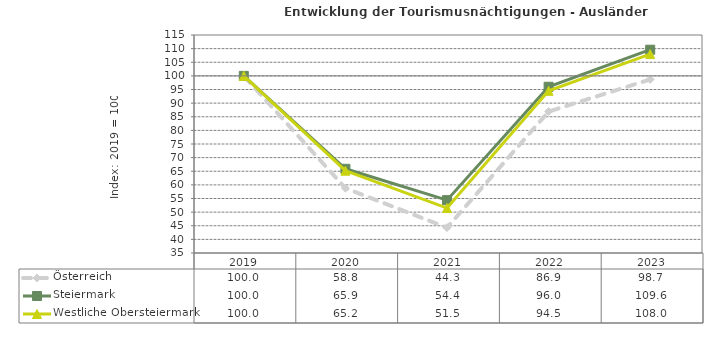
| Category | Österreich | Steiermark | Westliche Obersteiermark |
|---|---|---|---|
| 2023.0 | 98.7 | 109.6 | 108 |
| 2022.0 | 86.9 | 96 | 94.5 |
| 2021.0 | 44.3 | 54.4 | 51.5 |
| 2020.0 | 58.8 | 65.9 | 65.2 |
| 2019.0 | 100 | 100 | 100 |